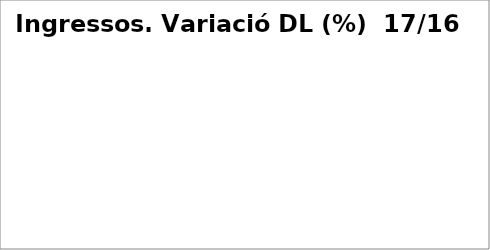
| Category | Series 0 |
|---|---|
| Impostos directes** | 0.718 |
| Impostos indirectes** | -0.028 |
| Taxes, preus públics i altres ingressos | -0.652 |
| Transferències corrents** | -0.067 |
| Ingressos patrimonials | -0.08 |
| Venda d'inversions reals | 0 |
| Transferències de capital | 0 |
| Actius financers* | 0 |
| Passius financers | 1.221 |